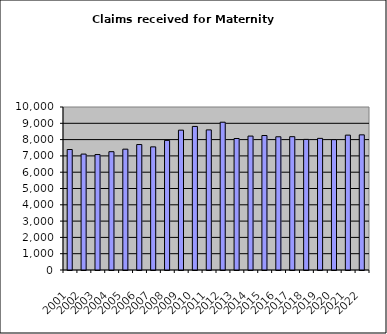
| Category | Series 1 |
|---|---|
| 2001.0 | 7392 |
| 2002.0 | 7111 |
| 2003.0 | 7083 |
| 2004.0 | 7258 |
| 2005.0 | 7413 |
| 2006.0 | 7697 |
| 2007.0 | 7554 |
| 2008.0 | 7952 |
| 2009.0 | 8579 |
| 2010.0 | 8808 |
| 2011.0 | 8595 |
| 2012.0 | 9067 |
| 2013.0 | 8067 |
| 2014.0 | 8216 |
| 2015.0 | 8250 |
| 2016.0 | 8173 |
| 2017.0 | 8179 |
| 2018.0 | 8013 |
| 2019.0 | 8076 |
| 2020.0 | 7996 |
| 2021.0 | 8274 |
| 2022.0 | 8291 |